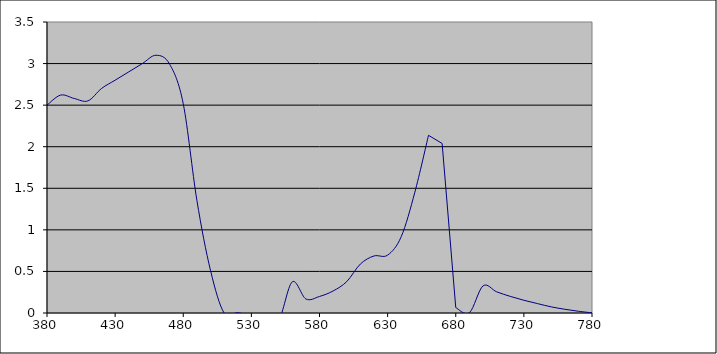
| Category | Series 0 |
|---|---|
| 780.0 | 0.002 |
| 770.0 | 0.021 |
| 760.0 | 0.045 |
| 750.0 | 0.074 |
| 740.0 | 0.113 |
| 730.0 | 0.153 |
| 720.0 | 0.2 |
| 710.0 | 0.255 |
| 700.0 | 0.326 |
| 690.0 | 0.003 |
| 680.0 | 0.065 |
| 670.0 | 2.039 |
| 660.0 | 2.137 |
| 650.0 | 1.454 |
| 640.0 | 0.919 |
| 630.0 | 0.696 |
| 620.0 | 0.686 |
| 610.0 | 0.589 |
| 600.0 | 0.378 |
| 590.0 | 0.265 |
| 580.0 | 0.199 |
| 570.0 | 0.169 |
| 560.0 | 0.375 |
| 550.0 | -0.086 |
| 540.0 | -0.052 |
| 530.0 | -0.037 |
| 520.0 | 0.004 |
| 510.0 | 0 |
| 500.0 | 0.512 |
| 490.0 | 1.356 |
| 480.0 | 2.516 |
| 470.0 | 2.993 |
| 460.0 | 3.1 |
| 450.0 | 3 |
| 440.0 | 2.9 |
| 430.0 | 2.8 |
| 420.0 | 2.7 |
| 410.0 | 2.551 |
| 400.0 | 2.58 |
| 390.0 | 2.621 |
| 380.0 | 2.5 |